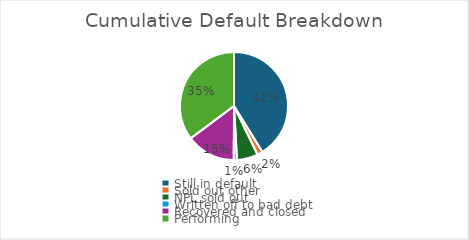
| Category | Cumulative Default Breakdown |
|---|---|
| Still in default | 0.412 |
| Sold out other | 0.016 |
| NPL sold out | 0.063 |
| Written off to bad debt | 0.009 |
| Recovered and closed | 0.147 |
| Performing | 0.352 |